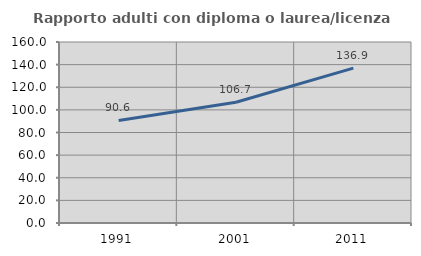
| Category | Rapporto adulti con diploma o laurea/licenza media  |
|---|---|
| 1991.0 | 90.633 |
| 2001.0 | 106.716 |
| 2011.0 | 136.922 |